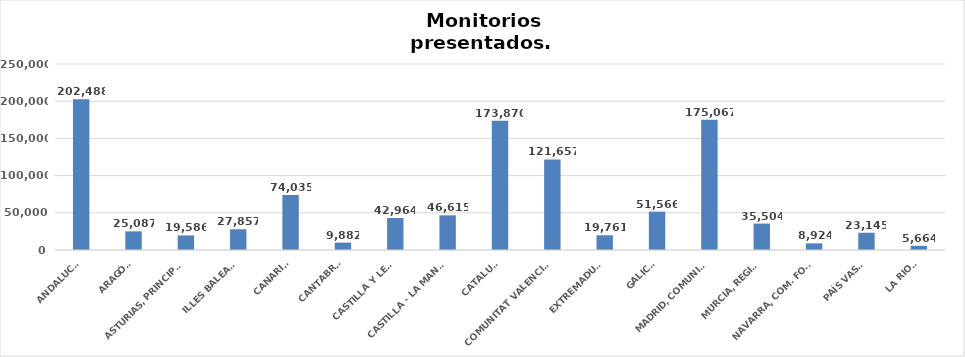
| Category | Series 0 |
|---|---|
| ANDALUCÍA | 202488 |
| ARAGÓN | 25087 |
| ASTURIAS, PRINCIPADO | 19586 |
| ILLES BALEARS | 27857 |
| CANARIAS | 74035 |
| CANTABRIA | 9882 |
| CASTILLA Y LEÓN | 42964 |
| CASTILLA - LA MANCHA | 46615 |
| CATALUÑA | 173870 |
| COMUNITAT VALENCIANA | 121657 |
| EXTREMADURA | 19761 |
| GALICIA | 51566 |
| MADRID, COMUNIDAD | 175067 |
| MURCIA, REGIÓN | 35504 |
| NAVARRA, COM. FORAL | 8924 |
| PAÍS VASCO | 23145 |
| LA RIOJA | 5664 |